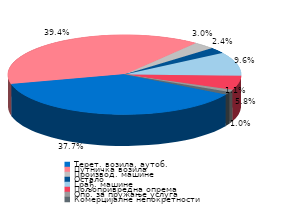
| Category | Series 0 |
|---|---|
| Терет. возила, аутоб. | 0.377 |
| Путничка возила | 0.394 |
| Производ. машине | 0.03 |
| Остало | 0.024 |
| Грађ. машине | 0.096 |
| Пољопривредна опрема | 0.058 |
| Опр. за пружање услуга | 0.01 |
| Комерцијалне непокретности | 0.011 |